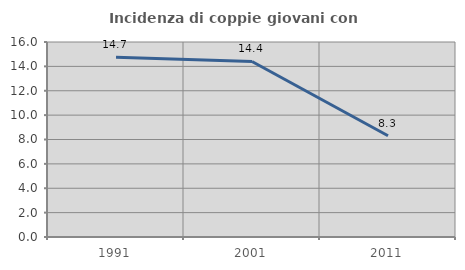
| Category | Incidenza di coppie giovani con figli |
|---|---|
| 1991.0 | 14.749 |
| 2001.0 | 14.403 |
| 2011.0 | 8.305 |